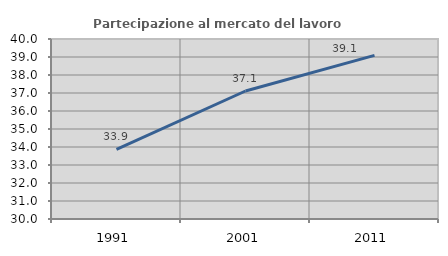
| Category | Partecipazione al mercato del lavoro  femminile |
|---|---|
| 1991.0 | 33.863 |
| 2001.0 | 37.111 |
| 2011.0 | 39.092 |